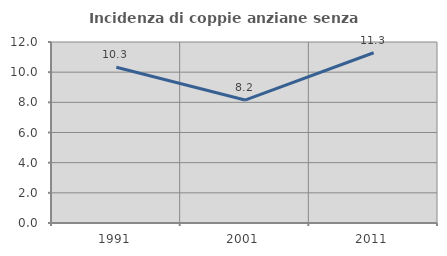
| Category | Incidenza di coppie anziane senza figli  |
|---|---|
| 1991.0 | 10.327 |
| 2001.0 | 8.152 |
| 2011.0 | 11.285 |